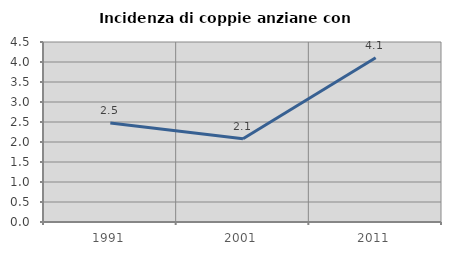
| Category | Incidenza di coppie anziane con figli |
|---|---|
| 1991.0 | 2.474 |
| 2001.0 | 2.083 |
| 2011.0 | 4.107 |